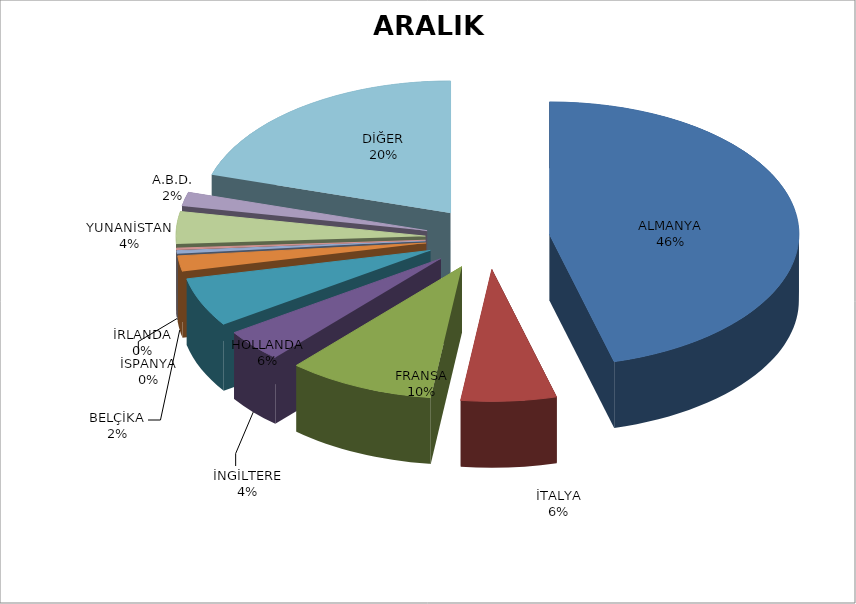
| Category | Series 0 |
|---|---|
| ALMANYA | 12573 |
| İTALYA | 1695 |
| FRANSA | 2620 |
| İNGİLTERE | 1097 |
| HOLLANDA | 1647 |
| BELÇİKA | 522 |
| İSPANYA | 100 |
| İRLANDA | 64 |
| YUNANİSTAN | 1081 |
| A.B.D. | 469 |
| DİĞER | 5573 |